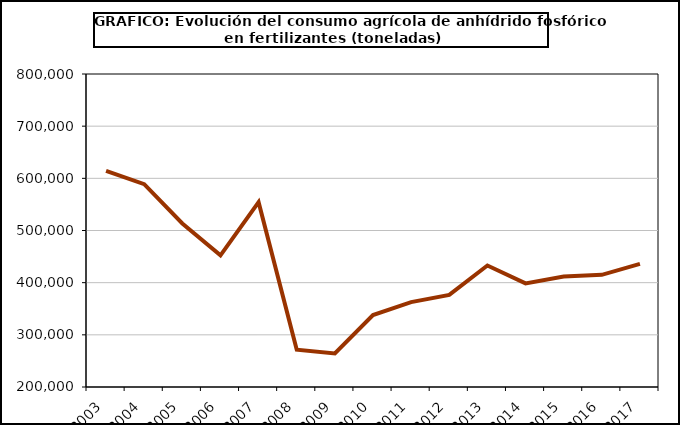
| Category | fertilizantes |
|---|---|
| 2003.0 | 614385 |
| 2004.0 | 588820 |
| 2005.0 | 513454 |
| 2006.0 | 452461 |
| 2007.0 | 554382 |
| 2008.0 | 271578 |
| 2009.0 | 264211 |
| 2010.0 | 337812 |
| 2011.0 | 362672 |
| 2012.0 | 376590 |
| 2013.0 | 432904 |
| 2014.0 | 398580 |
| 2015.0 | 411763 |
| 2016.0 | 414974 |
| 2017.0 | 436110 |